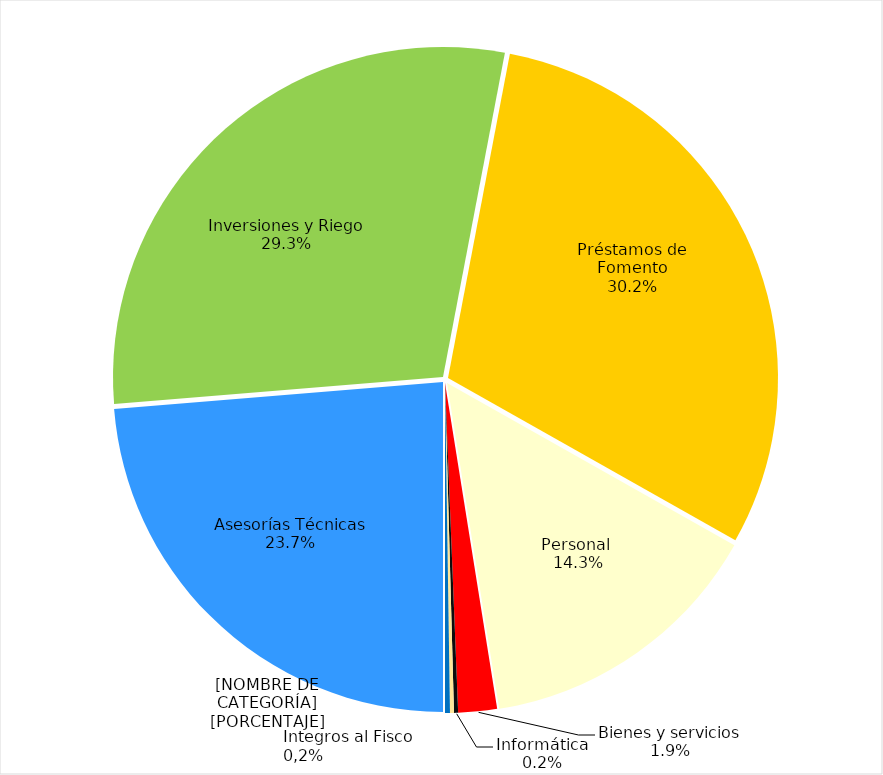
| Category | Series 0 |
|---|---|
| Asesorías Técnicas | 87692359 |
| Inversiones y Riego | 108411798 |
| Préstamos de Fomento | 111644866 |
| Personal  | 52882820 |
| Bienes y servicios | 6999594 |
| Informática | 743658 |
| Vehículos, Mobiliario,  Maquinas y Equipos | 713966 |
| Integros al Fisco y Otros | 892022 |